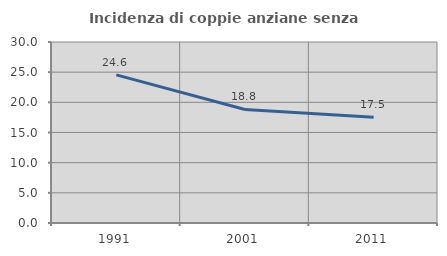
| Category | Incidenza di coppie anziane senza figli  |
|---|---|
| 1991.0 | 24.551 |
| 2001.0 | 18.817 |
| 2011.0 | 17.512 |